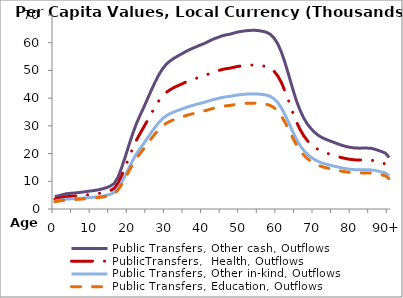
| Category | Public Transfers, Other cash, Outflows | PublicTransfers,  Health, Outflows | Public Transfers, Other in-kind, Outflows | Public Transfers, Education, Outflows |
|---|---|---|---|---|
| 0 | 4505.44 | 3629.496 | 2902.775 | 2669.73 |
|  | 4768.715 | 3841.585 | 3072.398 | 2825.736 |
| 2 | 5155.716 | 4153.346 | 3321.736 | 3055.056 |
| 3 | 5484.589 | 4418.279 | 3533.622 | 3249.932 |
| 4 | 5628.442 | 4534.165 | 3626.305 | 3335.173 |
| 5 | 5740.204 | 4624.198 | 3698.311 | 3401.399 |
| 6 | 5863.756 | 4723.729 | 3777.913 | 3474.61 |
| 7 | 6010.51 | 4841.952 | 3872.464 | 3561.57 |
| 8 | 6216.836 | 5008.164 | 4005.396 | 3683.83 |
| 9 | 6385.979 | 5144.422 | 4114.372 | 3784.057 |
| 10 | 6562.709 | 5286.793 | 4228.236 | 3888.78 |
| 11 | 6743.983 | 5432.823 | 4345.028 | 3996.195 |
| 12 | 7009.953 | 5647.084 | 4516.388 | 4153.797 |
| 13 | 7329.549 | 5904.544 | 4722.298 | 4343.176 |
| 14 | 7759.945 | 6251.263 | 4999.594 | 4598.21 |
| 15 | 8309.538 | 6694.004 | 5353.687 | 4923.876 |
| 16 | 9236.763 | 7440.959 | 5951.081 | 5473.309 |
| 17 | 11490.081 | 9256.188 | 7402.854 | 6808.529 |
| 18 | 14977.974 | 12065.968 | 9650.041 | 8875.304 |
| 19 | 19034.706 | 15333.994 | 12263.721 | 11279.15 |
| 20 | 23265.798 | 18742.48 | 14989.738 | 13786.313 |
| 21 | 27359.822 | 22040.548 | 17627.445 | 16212.256 |
| 22 | 30949.034 | 24931.948 | 19939.91 | 18339.069 |
| 23 | 33980.487 | 27374.028 | 21893.021 | 20135.378 |
| 24 | 36871.264 | 29702.783 | 23755.497 | 21848.329 |
| 25 | 39889.198 | 32133.972 | 25699.898 | 23636.627 |
| 26 | 42945.782 | 34596.297 | 27669.2 | 25447.827 |
| 27 | 45838.18 | 36926.358 | 29532.721 | 27161.738 |
| 28 | 48444.072 | 39025.615 | 31211.65 | 28705.878 |
| 29 | 50596.047 | 40759.205 | 32598.129 | 29981.046 |
| 30 | 52214.955 | 42063.365 | 33641.162 | 30940.341 |
| 31 | 53386.009 | 43006.744 | 34395.652 | 31634.258 |
| 32 | 54333.782 | 43770.252 | 35006.285 | 32195.867 |
| 33 | 55127.378 | 44409.557 | 35517.584 | 32666.118 |
| 34 | 55863.46 | 45002.531 | 35991.829 | 33102.289 |
| 35 | 56629.327 | 45619.499 | 36485.264 | 33556.109 |
| 36 | 57340.594 | 46192.482 | 36943.521 | 33977.575 |
| 37 | 57931.294 | 46668.339 | 37324.098 | 34327.598 |
| 38 | 58507.664 | 47132.651 | 37695.442 | 34669.13 |
| 39 | 59068.74 | 47584.643 | 38056.934 | 35001.6 |
| 40 | 59586.671 | 48001.878 | 38390.628 | 35308.504 |
| 41 | 60201.715 | 48497.346 | 38786.889 | 35672.952 |
| 42 | 60909.311 | 49067.372 | 39242.781 | 36092.243 |
| 43 | 61476.877 | 49524.592 | 39608.453 | 36428.559 |
| 44 | 61954.159 | 49909.081 | 39915.958 | 36711.376 |
| 45 | 62450.023 | 50308.539 | 40235.434 | 37005.203 |
| 46 | 62814.577 | 50602.217 | 40470.31 | 37221.222 |
| 47 | 63037.752 | 50782.003 | 40614.097 | 37353.466 |
| 48 | 63401.207 | 51074.795 | 40848.265 | 37568.834 |
| 49 | 63797.578 | 51394.104 | 41103.64 | 37803.706 |
| 50 | 64043.534 | 51592.241 | 41262.104 | 37949.449 |
| 51 | 64244.307 | 51753.98 | 41391.459 | 38068.419 |
| 52 | 64387.668 | 51869.469 | 41483.824 | 38153.368 |
| 53 | 64468.292 | 51934.418 | 41535.768 | 38201.143 |
| 54 | 64469.601 | 51935.473 | 41536.612 | 38201.919 |
| 55 | 64336.188 | 51827.998 | 41450.657 | 38122.864 |
| 56 | 64101.831 | 51639.205 | 41299.665 | 37983.994 |
| 57 | 63743.918 | 51350.877 | 41069.068 | 37771.91 |
| 58 | 63036.032 | 50780.617 | 40612.989 | 37352.447 |
| 59 | 61709.329 | 49711.851 | 39758.218 | 36566.3 |
| 60 | 59642.744 | 48047.05 | 38426.755 | 35341.73 |
| 61 | 56588.647 | 45586.728 | 36459.054 | 33532.004 |
| 62 | 52651.224 | 42414.815 | 33922.243 | 31198.855 |
| 63 | 48159.553 | 38796.411 | 31028.339 | 28537.284 |
| 64 | 43511.229 | 35051.811 | 28033.507 | 25782.887 |
| 65 | 39210.811 | 31587.476 | 25262.825 | 23234.643 |
| 66 | 35679.546 | 28742.757 | 22987.694 | 21142.167 |
| 67 | 32836.243 | 26452.247 | 21155.805 | 19457.348 |
| 68 | 30614.293 | 24662.286 | 19724.242 | 18140.716 |
| 69 | 28950.881 | 23322.274 | 18652.535 | 17155.049 |
| 70 | 27600.937 | 22234.785 | 17782.79 | 16355.13 |
| 71 | 26506.915 | 21353.462 | 17077.932 | 15706.86 |
| 72 | 25725.647 | 20724.088 | 16574.575 | 15243.915 |
| 73 | 25121.585 | 20237.467 | 16185.389 | 14885.973 |
| 74 | 24584.944 | 19805.159 | 15839.64 | 14567.983 |
| 75 | 24096.636 | 19411.788 | 15525.032 | 14278.632 |
| 76 | 23592.592 | 19005.739 | 15200.286 | 13979.958 |
| 77 | 23095.823 | 18605.552 | 14880.226 | 13685.594 |
| 78 | 22701.889 | 18288.206 | 14626.422 | 13452.165 |
| 79 | 22368.316 | 18019.486 | 14411.506 | 13254.504 |
| 80 | 22152.185 | 17845.375 | 14272.257 | 13126.434 |
| 81 | 21982.613 | 17708.771 | 14163.005 | 13025.953 |
| 82 | 21960.255 | 17690.76 | 14148.6 | 13012.705 |
| 83 | 21970.131 | 17698.716 | 14154.963 | 13018.556 |
| 84 | 21983.024 | 17709.102 | 14163.27 | 13026.196 |
| 85 | 21911.982 | 17651.872 | 14117.499 | 12984.1 |
| 86 | 21631.04 | 17425.551 | 13936.493 | 12817.626 |
| 87 | 21185.35 | 17066.511 | 13649.343 | 12553.529 |
| 88 | 20707.293 | 16681.397 | 13341.339 | 12270.253 |
| 89 | 20163.495 | 16243.324 | 12990.979 | 11948.022 |
| 90+ | 18591.023 | 14976.571 | 11977.864 | 11016.242 |